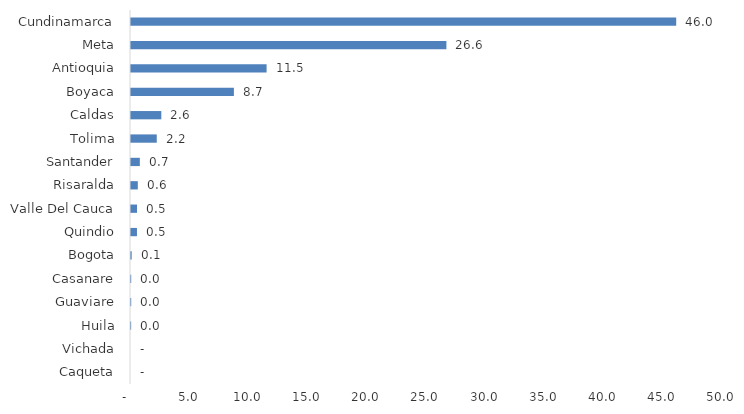
| Category | Series 0 |
|---|---|
| Caqueta | 0 |
| Vichada | 0 |
| Huila | 0.013 |
| Guaviare | 0.017 |
| Casanare | 0.018 |
| Bogota | 0.058 |
| Quindio | 0.502 |
| Valle Del Cauca | 0.505 |
| Risaralda | 0.574 |
| Santander | 0.746 |
| Tolima | 2.176 |
| Caldas | 2.559 |
| Boyaca | 8.689 |
| Antioquia | 11.453 |
| Meta | 26.639 |
| Cundinamarca | 46.049 |